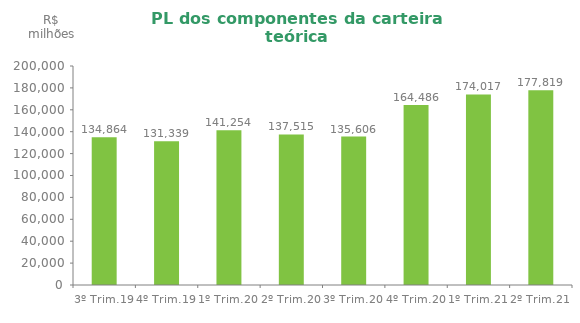
| Category | Series 0 |
|---|---|
| 3º Trim.19 | 134863.51 |
| 4º Trim.19 | 131338.794 |
| 1º Trim.20 | 141254.49 |
| 2º Trim.20 | 137515.45 |
| 3º Trim.20 | 135605.88 |
| 4º Trim.20 | 164486.25 |
| 1º Trim.21 | 174016.57 |
| 2º Trim.21 | 177819.2 |